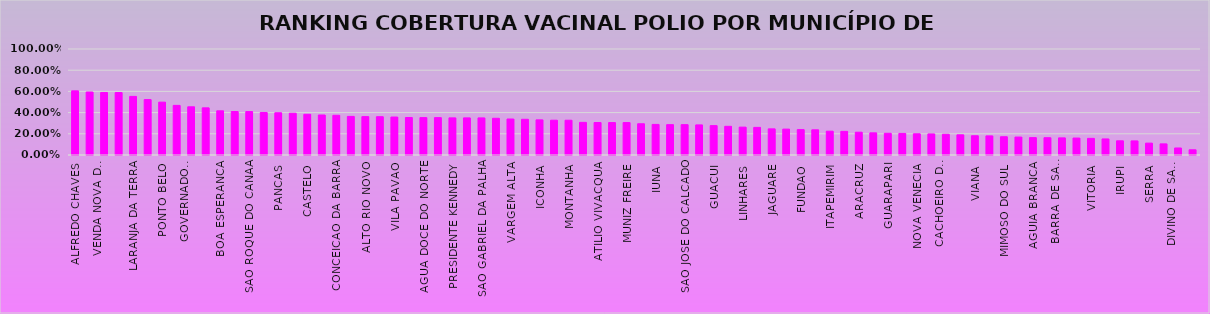
| Category | % COBERTURA VACINAL POLIO |
|---|---|
| ALFREDO CHAVES | 0.605 |
| MUQUI | 0.594 |
| VENDA NOVA DO IMIGRANTE | 0.59 |
| AFONSO CLAUDIO | 0.589 |
| LARANJA DA TERRA | 0.553 |
| SOORETAMA | 0.523 |
| PONTO BELO | 0.499 |
| ALEGRE | 0.468 |
| GOVERNADOR LINDENBERG | 0.455 |
| CONCEICAO DO CASTELO | 0.445 |
| BOA ESPERANCA | 0.417 |
| SANTA TERESA | 0.41 |
| SAO ROQUE DO CANAA | 0.41 |
| RIO BANANAL | 0.401 |
| PANCAS | 0.398 |
| DOMINGOS MARTINS | 0.394 |
| CASTELO | 0.384 |
| ITAGUACU | 0.377 |
| CONCEICAO DA BARRA | 0.375 |
| MARILANDIA | 0.364 |
| ALTO RIO NOVO | 0.362 |
| APIACA | 0.361 |
| VILA PAVAO | 0.358 |
| JOAO NEIVA | 0.354 |
| AGUA DOCE DO NORTE | 0.353 |
| BOM JESUS DO NORTE | 0.353 |
| PRESIDENTE KENNEDY | 0.35 |
| PEDRO CANARIO | 0.35 |
| SAO GABRIEL DA PALHA | 0.35 |
| IBIRACU | 0.346 |
| VARGEM ALTA | 0.34 |
| RIO NOVO DO SUL | 0.337 |
| ICONHA | 0.331 |
| PIUMA | 0.328 |
| MONTANHA | 0.328 |
| MARECHAL FLORIANO | 0.308 |
| ATILIO VIVACQUA | 0.306 |
| BREJETUBA | 0.306 |
| MUNIZ FREIRE | 0.306 |
| VILA VALERIO | 0.295 |
| IUNA | 0.289 |
| ITARANA | 0.286 |
| SAO JOSE DO CALCADO | 0.286 |
| JERONIMO MONTEIRO | 0.284 |
| GUACUI | 0.277 |
| ANCHIETA | 0.271 |
| LINHARES | 0.263 |
| IBATIBA | 0.261 |
| JAGUARE | 0.247 |
| MARATAIZES | 0.244 |
| FUNDAO | 0.24 |
| BAIXO GUANDU | 0.238 |
| ITAPEMIRIM | 0.225 |
| SAO DOMINGOS DO NORTE | 0.223 |
| ARACRUZ | 0.215 |
| MUCURICI | 0.209 |
| GUARAPARI | 0.205 |
| ECOPORANGA | 0.204 |
| NOVA VENECIA | 0.2 |
| PINHEIROS | 0.199 |
| CACHOEIRO DE ITAPEMIRIM | 0.196 |
| SAO MATEUS | 0.19 |
| VIANA | 0.182 |
| DORES DO RIO PRETO | 0.18 |
| MIMOSO DO SUL | 0.172 |
| SANTA LEOPOLDINA | 0.169 |
| AGUIA BRANCA | 0.164 |
| VILA VELHA | 0.163 |
| BARRA DE SAO FRANCISCO | 0.161 |
| SANTA MARIA DE JETIBA | 0.16 |
| VITORIA | 0.157 |
| CARIACICA | 0.152 |
| IRUPI | 0.134 |
| COLATINA | 0.133 |
| SERRA | 0.112 |
| MANTENOPOLIS | 0.105 |
| DIVINO DE SAO LOURENCO | 0.066 |
| IBITIRAMA | 0.049 |